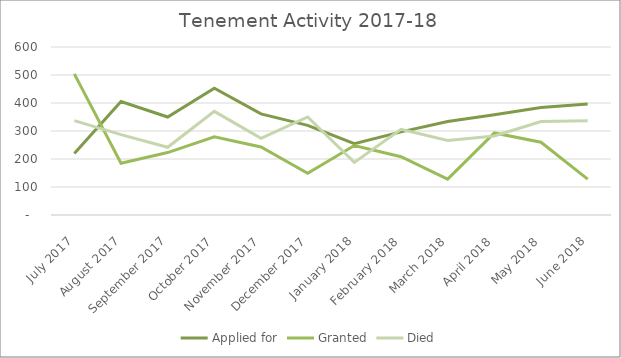
| Category | Applied for | Granted | Died |
|---|---|---|---|
| 2017-07-01 | 220 | 504 | 337 |
| 2017-08-01 | 405 | 185 | 287 |
| 2017-09-01 | 350 | 223 | 242 |
| 2017-10-01 | 453 | 279 | 370 |
| 2017-11-01 | 361 | 243 | 274 |
| 2017-12-01 | 320 | 149 | 350 |
| 2018-01-01 | 255 | 248 | 188 |
| 2018-02-01 | 297 | 208 | 306 |
| 2018-03-01 | 334 | 128 | 266 |
| 2018-04-01 | 358 | 293 | 282 |
| 2018-05-01 | 384 | 260 | 334 |
| 2018-06-01 | 396 | 128 | 337 |